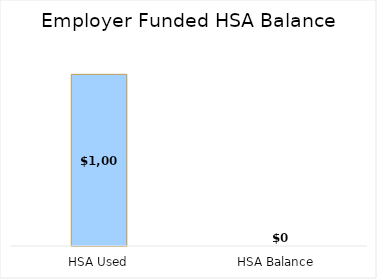
| Category | Series 2 |
|---|---|
| HSA Used | 1000 |
| HSA Balance | 0 |